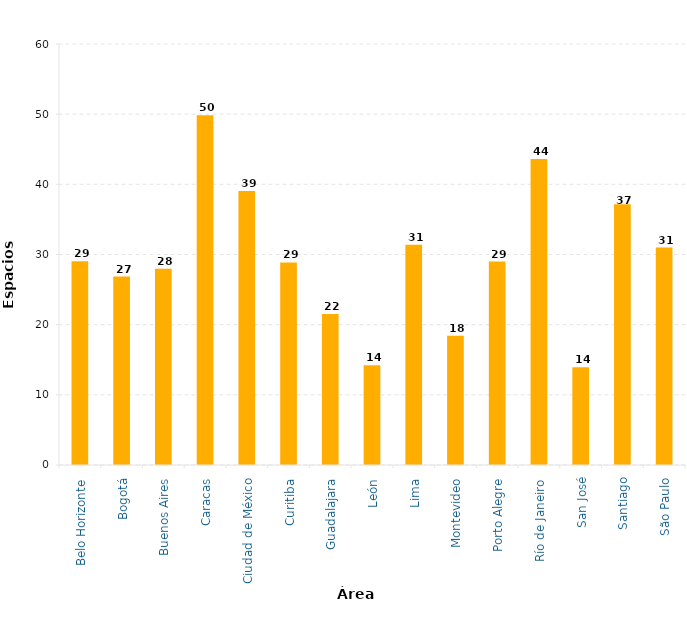
| Category | Espacios disponibles-km/habitante |
|---|---|
| Belo Horizonte | 29.051 |
| Bogotá | 26.856 |
| Buenos Aires | 27.964 |
| Caracas | 49.862 |
| Ciudad de México | 39.066 |
| Curitiba | 28.86 |
| Guadalajara | 21.531 |
| León | 14.203 |
| Lima | 31.373 |
| Montevideo | 18.42 |
| Porto Alegre | 28.993 |
| Río de Janeiro | 43.604 |
| San José | 13.941 |
| Santiago | 37.176 |
| São Paulo | 30.986 |